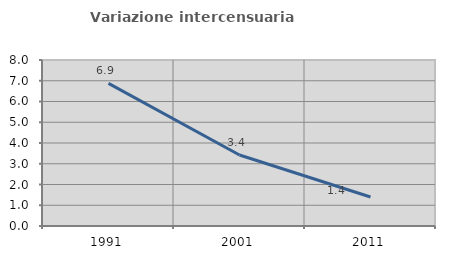
| Category | Variazione intercensuaria annua |
|---|---|
| 1991.0 | 6.876 |
| 2001.0 | 3.422 |
| 2011.0 | 1.396 |